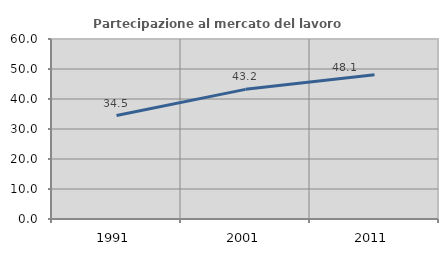
| Category | Partecipazione al mercato del lavoro  femminile |
|---|---|
| 1991.0 | 34.5 |
| 2001.0 | 43.216 |
| 2011.0 | 48.055 |